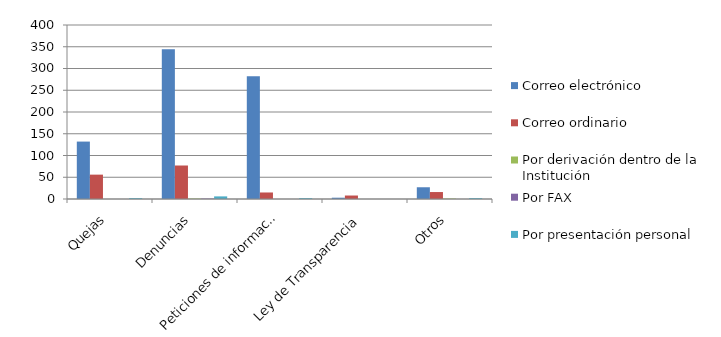
| Category | Correo electrónico  | Correo ordinario | Por derivación dentro de la Institución | Por FAX | Por presentación personal |
|---|---|---|---|---|---|
| Quejas | 132 | 56 | 0 | 0 | 2 |
| Denuncias | 344 | 77 | 1 | 1 | 6 |
| Peticiones de información | 282 | 15 | 0 | 0 | 2 |
| Ley de Transparencia | 3 | 8 | 0 | 0 | 0 |
| Otros | 27 | 16 | 1 | 0 | 2 |